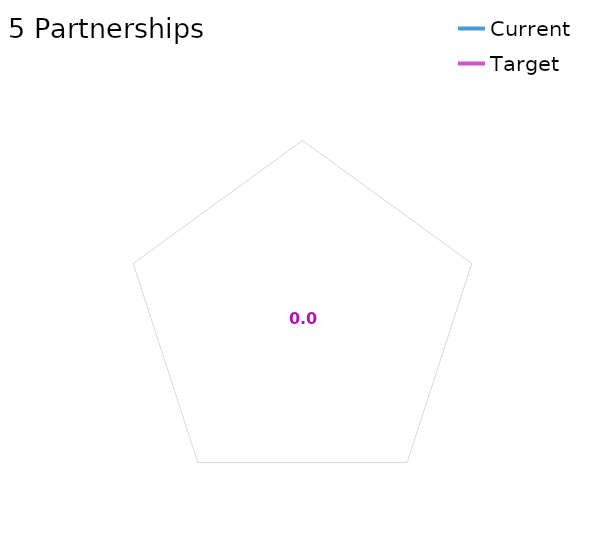
| Category | Current | Target |
|---|---|---|
| 5 Partnerships average | 0 | 0 |
| 5.1 Strategy well understood by external partners | 0 | 0 |
| 5.2 Wider system has successful track record | 0 | 0 |
| 5.3 Strategy delivered in partnership with providers | 0 | 0 |
| 5.4 Aligned incentives and pricing mechanisms | 0 | 0 |